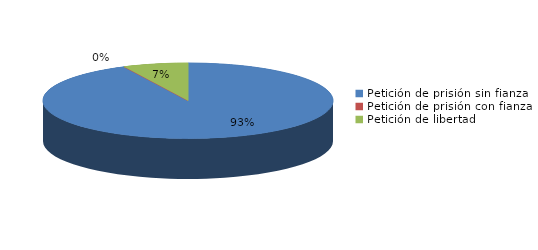
| Category | Series 0 |
|---|---|
| Petición de prisión sin fianza | 51 |
| Petición de prisión con fianza | 0 |
| Petición de libertad | 4 |